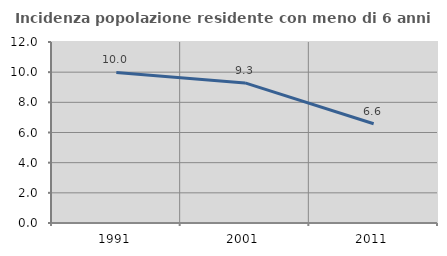
| Category | Incidenza popolazione residente con meno di 6 anni |
|---|---|
| 1991.0 | 9.979 |
| 2001.0 | 9.288 |
| 2011.0 | 6.578 |